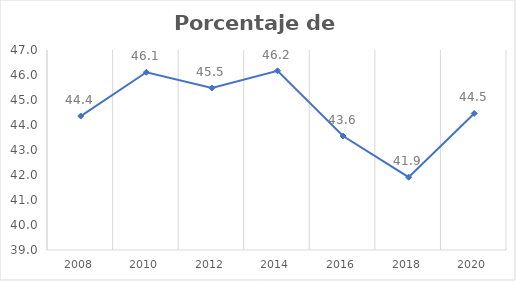
| Category | Series 0 |
|---|---|
| 2008.0 | 44.358 |
| 2010.0 | 46.109 |
| 2012.0 | 45.479 |
| 2014.0 | 46.168 |
| 2016.0 | 43.558 |
| 2018.0 | 41.913 |
| 2020.0 | 44.461 |